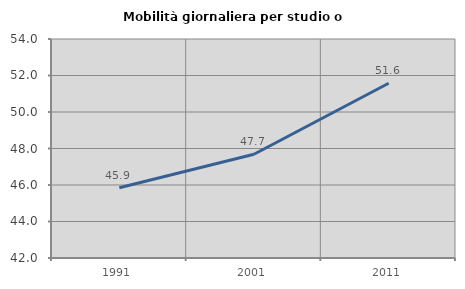
| Category | Mobilità giornaliera per studio o lavoro |
|---|---|
| 1991.0 | 45.853 |
| 2001.0 | 47.684 |
| 2011.0 | 51.573 |